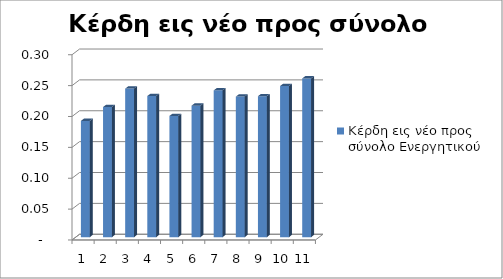
| Category | Κέρδη εις νέο προς σύνολο Ενεργητικού |
|---|---|
| 0 | 0.188 |
| 1 | 0.211 |
| 2 | 0.241 |
| 3 | 0.229 |
| 4 | 0.196 |
| 5 | 0.213 |
| 6 | 0.238 |
| 7 | 0.228 |
| 8 | 0.228 |
| 9 | 0.245 |
| 10 | 0.257 |